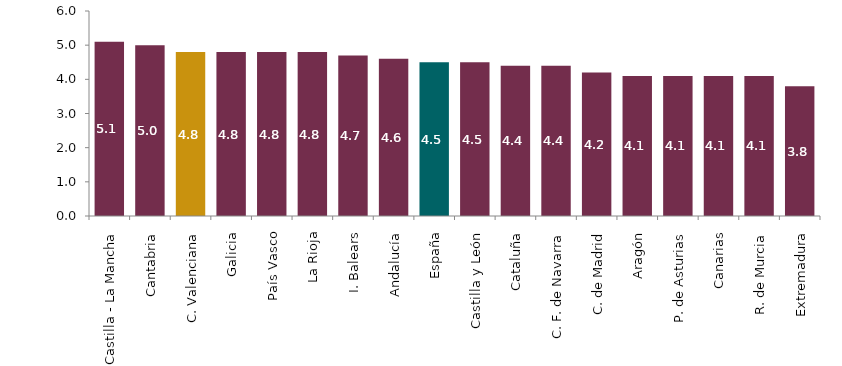
| Category | Series 0 |
|---|---|
| Castilla - La Mancha | 5.1 |
| Cantabria | 5 |
| C. Valenciana | 4.8 |
| Galicia | 4.8 |
| País Vasco | 4.8 |
| La Rioja | 4.8 |
| I. Balears | 4.7 |
| Andalucía | 4.6 |
| España | 4.5 |
| Castilla y León | 4.5 |
| Cataluña | 4.4 |
| C. F. de Navarra | 4.4 |
| C. de Madrid | 4.2 |
| Aragón | 4.1 |
| P. de Asturias | 4.1 |
| Canarias | 4.1 |
| R. de Murcia | 4.1 |
| Extremadura | 3.8 |